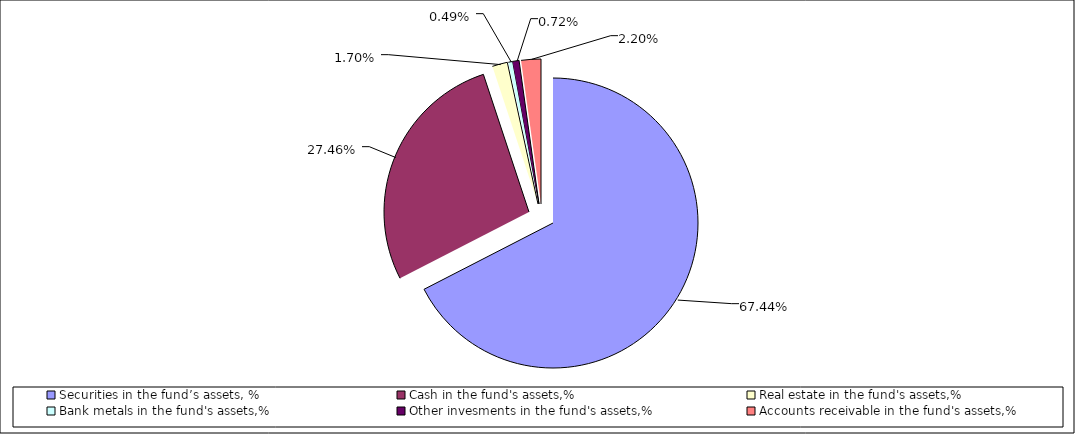
| Category | Series 0 |
|---|---|
| Securities in the fund’s assets, % | 0.674 |
| Cash in the fund's assets,% | 0.275 |
| Real estate in the fund's assets,% | 0.017 |
| Bank metals in the fund's assets,% | 0.005 |
| Other invesments in the fund's assets,%     | 0.007 |
| Accounts receivable in the fund's assets,%    | 0.022 |